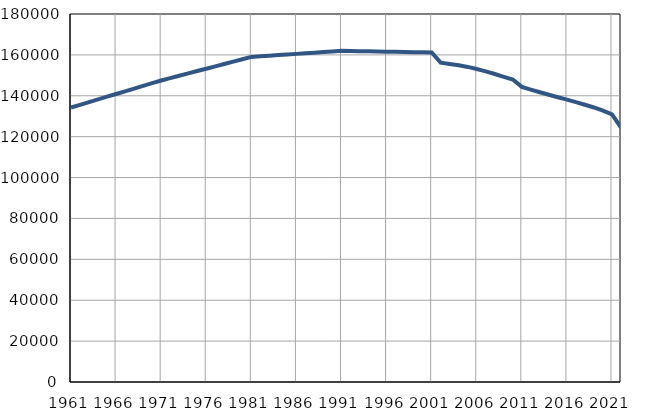
| Category | Population
size |
|---|---|
| 1961.0 | 134250 |
| 1962.0 | 135574 |
| 1963.0 | 136897 |
| 1964.0 | 138221 |
| 1965.0 | 139545 |
| 1966.0 | 140869 |
| 1967.0 | 142192 |
| 1968.0 | 143516 |
| 1969.0 | 144841 |
| 1970.0 | 146163 |
| 1971.0 | 147487 |
| 1972.0 | 148638 |
| 1973.0 | 149790 |
| 1974.0 | 150942 |
| 1975.0 | 152093 |
| 1976.0 | 153244 |
| 1977.0 | 154395 |
| 1978.0 | 155547 |
| 1979.0 | 156698 |
| 1980.0 | 157850 |
| 1981.0 | 159001 |
| 1982.0 | 159300 |
| 1983.0 | 159598 |
| 1984.0 | 159897 |
| 1985.0 | 160195 |
| 1986.0 | 160494 |
| 1987.0 | 160793 |
| 1988.0 | 161092 |
| 1989.0 | 161389 |
| 1990.0 | 161688 |
| 1991.0 | 161986 |
| 1992.0 | 161904 |
| 1993.0 | 161823 |
| 1994.0 | 161741 |
| 1995.0 | 161659 |
| 1996.0 | 161577 |
| 1997.0 | 161495 |
| 1998.0 | 161414 |
| 1999.0 | 161332 |
| 2000.0 | 161250 |
| 2001.0 | 161168 |
| 2002.0 | 156224 |
| 2003.0 | 155544 |
| 2004.0 | 154895 |
| 2005.0 | 154113 |
| 2006.0 | 153084 |
| 2007.0 | 151964 |
| 2008.0 | 150653 |
| 2009.0 | 149279 |
| 2010.0 | 147959 |
| 2011.0 | 144370 |
| 2012.0 | 143023 |
| 2013.0 | 141719 |
| 2014.0 | 140487 |
| 2015.0 | 139291 |
| 2016.0 | 138132 |
| 2017.0 | 136888 |
| 2018.0 | 135591 |
| 2019.0 | 134285 |
| 2020.0 | 132764 |
| 2021.0 | 130940 |
| 2022.0 | 124467 |